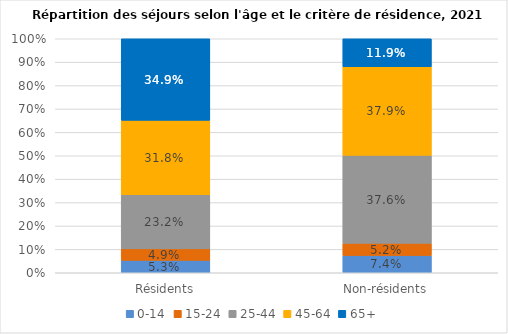
| Category | 0-14 | 15-24 | 25-44 | 45-64 | 65+ |
|---|---|---|---|---|---|
| Résidents | 0.053 | 0.049 | 0.232 | 0.318 | 0.349 |
| Non-résidents | 0.074 | 0.052 | 0.376 | 0.379 | 0.119 |